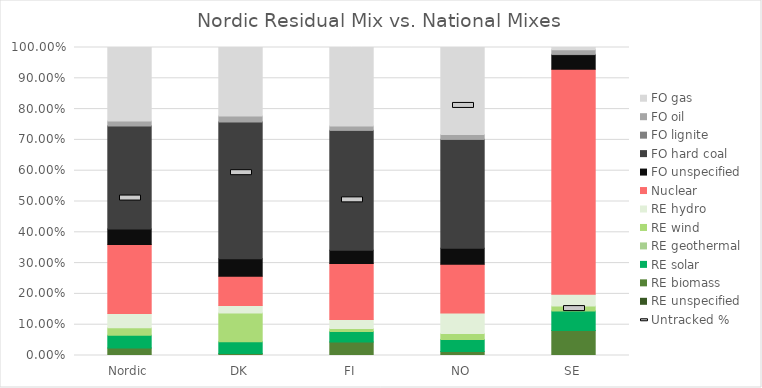
| Category | RE unspecified  | RE biomass | RE solar  | RE geothermal  | RE wind  | RE hydro  | Nuclear  | FO unspecified  | FO hard coal  | FO lignite  | FO oil  | FO gas  |
|---|---|---|---|---|---|---|---|---|---|---|---|---|
| Nordic | 0 | 0.024 | 0.042 | 0 | 0.024 | 0.046 | 0.224 | 0.05 | 0.334 | 0.001 | 0.016 | 0.239 |
| DK | 0 | 0.007 | 0.038 | 0 | 0.093 | 0.025 | 0.094 | 0.057 | 0.444 | 0.001 | 0.018 | 0.223 |
| FI | 0 | 0.044 | 0.033 | 0 | 0.01 | 0.03 | 0.182 | 0.043 | 0.389 | 0.001 | 0.014 | 0.255 |
| NO | 0 | 0.013 | 0.039 | 0 | 0.02 | 0.067 | 0.158 | 0.053 | 0.353 | 0.001 | 0.015 | 0.283 |
| SE | 0 | 0.081 | 0.063 | 0 | 0.016 | 0.038 | 0.73 | 0.048 | 0 | 0.001 | 0.015 | 0.007 |